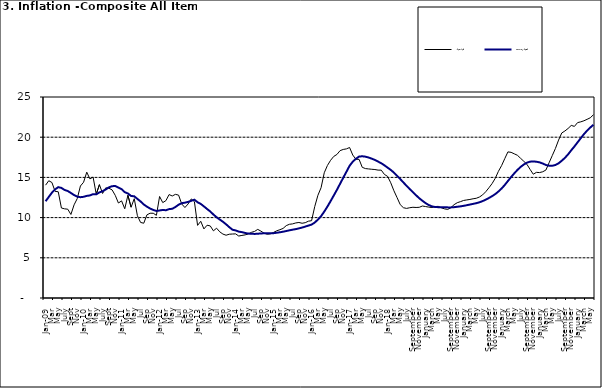
| Category | Year-on Rate | 12-Month Average |
|---|---|---|
| Jan-09 | 14.034 | 12.032 |
| Feb | 14.584 | 12.567 |
| Mar | 14.366 | 13.101 |
| Apr | 13.268 | 13.51 |
| May | 13.212 | 13.787 |
| June | 11.194 | 13.694 |
| July | 11.09 | 13.437 |
| Aug | 11.046 | 13.307 |
| Sept | 10.39 | 13.065 |
| Oct | 11.588 | 12.803 |
| Nov | 12.368 | 12.609 |
| Dec | 13.93 | 12.538 |
| Jan-10 | 14.398 | 12.586 |
| Feb | 15.649 | 12.7 |
| Mar | 14.812 | 12.757 |
| Apr | 15.044 | 12.915 |
| May | 12.915 | 12.893 |
| June | 14.099 | 13.132 |
| July | 13.002 | 13.284 |
| Aug | 13.702 | 13.5 |
| Sept | 13.65 | 13.764 |
| Oct | 13.45 | 13.908 |
| Nov | 12.766 | 13.928 |
| Dec | 11.815 | 13.74 |
| Jan-11 | 12.08 | 13.542 |
| Feb | 11.1 | 13.161 |
| Mar | 12.779 | 13.001 |
| Apr | 11.291 | 12.694 |
| May | 12.352 | 12.648 |
| Jun | 10.23 | 12.321 |
| Jul | 9.397 | 12.009 |
| Aug | 9.301 | 11.635 |
| Sep | 10.339 | 11.363 |
| Oct | 10.544 | 11.13 |
| Nov | 10.54 | 10.952 |
| Dec | 10.283 | 10.826 |
| Jan-12 | 12.626 | 10.886 |
| Feb | 11.866 | 10.955 |
| Mar | 12.111 | 10.914 |
| Apr | 12.866 | 11.054 |
| May | 12.688 | 11.096 |
| Jun | 12.892 | 11.32 |
| Jul | 12.797 | 11.599 |
| Aug | 11.689 | 11.791 |
| Sep | 11.253 | 11.859 |
| Oct | 11.693 | 11.948 |
| Nov | 12.32 | 12.091 |
| Dec | 11.981 | 12.224 |
| Jan-13 | 9.031 | 11.908 |
| Feb | 9.542 | 11.703 |
| Mar | 8.593 | 11.394 |
| Apr | 9.052 | 11.072 |
| May | 8.964 | 10.761 |
| Jun | 8.353 | 10.383 |
| Jul | 8.682 | 10.047 |
| Aug | 8.231 | 9.761 |
| Sep | 7.952 | 9.486 |
| Oct | 7.807 | 9.167 |
| Nov | 7.931 | 8.815 |
| Dec | 7.957 | 8.496 |
| Jan-14 | 7.977 | 8.408 |
| Feb | 7.707 | 8.257 |
| Mar | 7.783 | 8.19 |
| Apr | 7.851 | 8.092 |
| May | 7.965 | 8.012 |
| Jun | 8.167 | 7.998 |
| Jul | 8.281 | 7.968 |
| Aug | 8.534 | 7.996 |
| Sep | 8.317 | 8.027 |
| Oct | 8.06 | 8.047 |
| Nov | 7.927 | 8.046 |
| Dec | 7.978 | 8.047 |
| Jan-15 | 8.157 | 8.063 |
| Feb | 8.359 | 8.117 |
| Mar | 8.494 | 8.176 |
| Apr | 8.655 | 8.243 |
| May | 9.003 | 8.331 |
| Jun | 9.168 | 8.417 |
| Jul | 9.218 | 8.497 |
| Aug | 9.336 | 8.566 |
| Sep | 9.394 | 8.658 |
| Oct | 9.296 | 8.76 |
| Nov | 9.368 | 8.879 |
| Dec | 9.554 | 9.009 |
| Jan-16 | 9.617 | 9.13 |
| Feb | 11.379 | 9.386 |
| Mar | 12.775 | 9.751 |
| Apr | 13.721 | 10.182 |
| May | 15.577 | 10.746 |
| Jun | 16.48 | 11.372 |
| Jul | 17.127 | 12.045 |
| Aug | 17.609 | 12.744 |
| Sep | 17.852 | 13.454 |
| Oct | 18.33 | 14.206 |
| Nov | 18.476 | 14.958 |
| Dec | 18.547 | 15.697 |
| Jan-17 | 18.719 | 16.441 |
| Feb | 17.78 | 16.958 |
| Mar | 17.256 | 17.315 |
| Apr | 17.244 | 17.591 |
| May | 16.251 | 17.628 |
| Jun | 16.098 | 17.578 |
| Jul | 16.053 | 17.475 |
| Aug | 16.012 | 17.331 |
| Sep | 15.979 | 17.17 |
| Oct | 15.905 | 16.968 |
| Nov | 15.901 | 16.76 |
| Dec | 15.372 | 16.502 |
| Jan-18 | 15.127 | 16.215 |
| Feb | 14.33 | 15.93 |
| Mar | 13.337 | 15.599 |
| Apr | 12.482 | 15.196 |
| May | 11.608 | 14.793 |
| June | 11.231 | 14.371 |
| July | 11.142 | 13.95 |
| August | 11.227 | 13.546 |
| September | 11.284 | 13.157 |
| October | 11.259 | 12.777 |
| November | 11.281 | 12.406 |
| December | 11.442 | 12.095 |
| January | 11.374 | 11.801 |
| February | 11.306 | 11.564 |
| March | 11.251 | 11.401 |
| April | 11.372 | 11.314 |
| May | 11.396 | 11.299 |
| June | 11.217 | 11.297 |
| July | 11.084 | 11.291 |
| August | 11.016 | 11.271 |
| September | 11.244 | 11.268 |
| October | 11.607 | 11.298 |
| November | 11.854 | 11.348 |
| December | 11.982 | 11.396 |
| January | 12.132 | 11.462 |
| February | 12.199 | 11.539 |
| March | 12.257 | 11.624 |
| April | 12.341 | 11.706 |
| May | 12.404 | 11.791 |
| June | 12.559 | 11.904 |
| July | 12.821 | 12.049 |
| August | 13.22 | 12.233 |
| September | 13.707 | 12.44 |
| October | 14.233 | 12.664 |
| November | 14.887 | 12.923 |
| December | 15.753 | 13.246 |
| January | 16.466 | 13.616 |
| February | 17.335 | 14.053 |
| March | 18.171 | 14.554 |
| April | 18.117 | 15.039 |
| May | 17.933 | 15.499 |
| June | 17.751 | 15.927 |
| July | 17.377 | 16.298 |
| August | 17.009 | 16.601 |
| September | 16.63 | 16.83 |
| October | 15.994 | 16.958 |
| November | 15.396 | 16.979 |
| December | 15.625 | 16.953 |
| January | 15.601 | 16.869 |
| February | 15.702 | 16.728 |
| March | 15.915 | 16.544 |
| April | 16.819 | 16.449 |
| May | 17.712 | 16.449 |
| June | 18.596 | 16.542 |
| July | 19.643 | 16.755 |
| August | 20.525 | 17.07 |
| September | 20.774 | 17.432 |
| October | 21.087 | 17.865 |
| November | 21.466 | 18.372 |
| December | 21.344 | 18.847 |
| January | 21.816 | 19.362 |
| February | 21.91 | 19.873 |
| March | 22.043 | 20.375 |
| April | 22.222 | 20.816 |
| May | 22.413 | 21.2 |
| June | 22.789 | 21.544 |